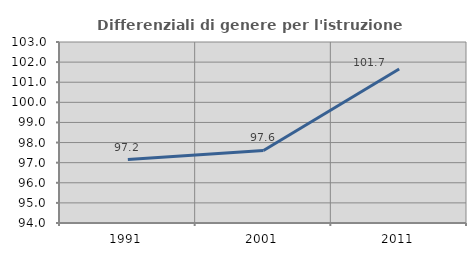
| Category | Differenziali di genere per l'istruzione superiore |
|---|---|
| 1991.0 | 97.153 |
| 2001.0 | 97.606 |
| 2011.0 | 101.655 |